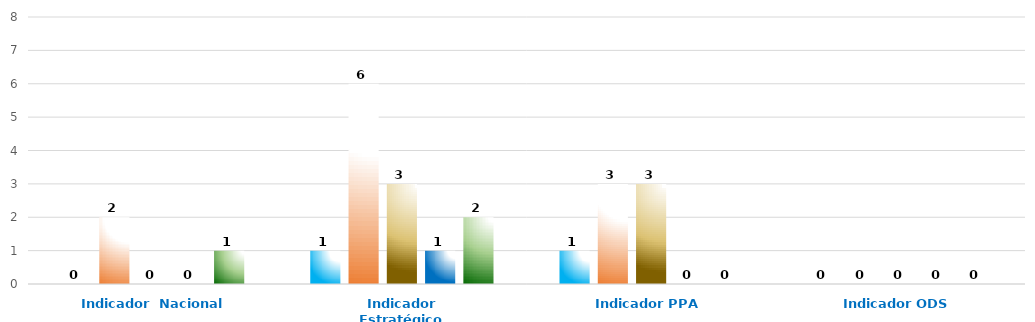
| Category | Series 0 | Series 1 | Series 2 | Series 3 | Series 4 |
|---|---|---|---|---|---|
| Indicador  Nacional | 0 | 2 | 0 | 0 | 1 |
| Indicador Estratégico | 1 | 6 | 3 | 1 | 2 |
| Indicador PPA | 1 | 3 | 3 | 0 | 0 |
| Indicador ODS | 0 | 0 | 0 | 0 | 0 |